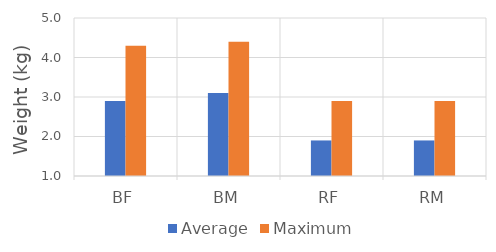
| Category | Average | Maximum |
|---|---|---|
| BF | 2.9 | 4.3 |
| BM | 3.1 | 4.4 |
| RF | 1.9 | 2.9 |
| RM | 1.9 | 2.9 |